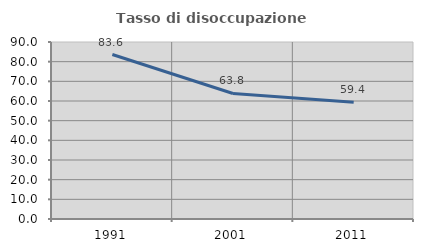
| Category | Tasso di disoccupazione giovanile  |
|---|---|
| 1991.0 | 83.621 |
| 2001.0 | 63.83 |
| 2011.0 | 59.375 |